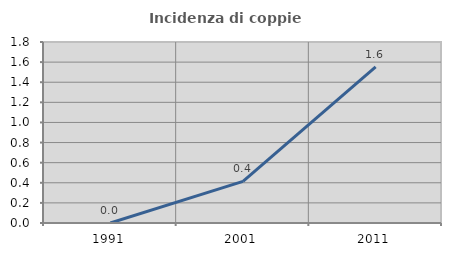
| Category | Incidenza di coppie miste |
|---|---|
| 1991.0 | 0 |
| 2001.0 | 0.415 |
| 2011.0 | 1.552 |